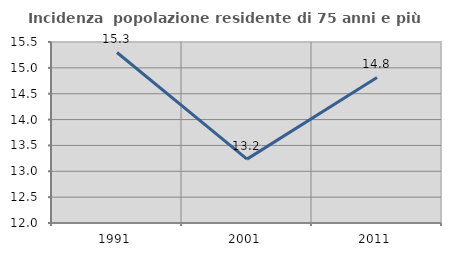
| Category | Incidenza  popolazione residente di 75 anni e più |
|---|---|
| 1991.0 | 15.297 |
| 2001.0 | 13.235 |
| 2011.0 | 14.815 |